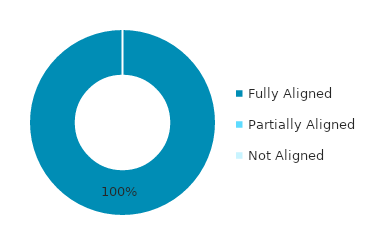
| Category | Series 0 |
|---|---|
| Fully Aligned | 1 |
| Partially Aligned | 0 |
| Not Aligned | 0 |